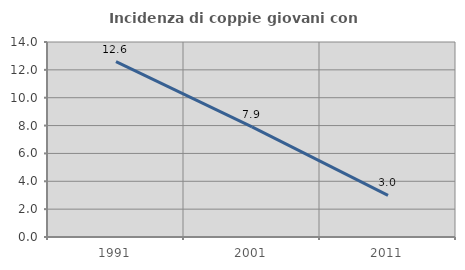
| Category | Incidenza di coppie giovani con figli |
|---|---|
| 1991.0 | 12.593 |
| 2001.0 | 7.91 |
| 2011.0 | 2.985 |